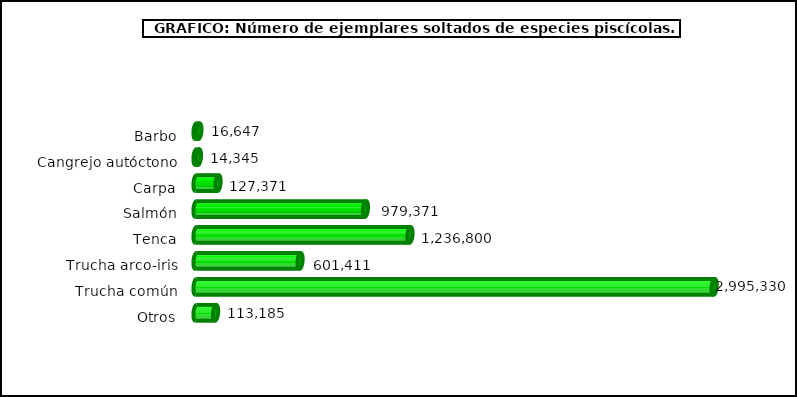
| Category | Series 1 |
|---|---|
| Barbo | 16647 |
| Cangrejo autóctono | 14345 |
| Carpa | 127371 |
| Salmón | 979371 |
| Tenca | 1236800 |
| Trucha arco-iris | 601411 |
| Trucha común | 2995330 |
| Otros | 113185 |